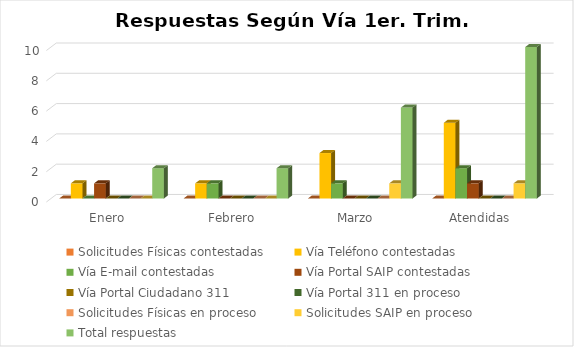
| Category | Solicitudes Físicas contestadas | Vía Teléfono contestadas | Vía E-mail contestadas | Vía Portal SAIP contestadas | Vía Portal Ciudadano 311  | Vía Portal 311 en proceso | Solicitudes Físicas en proceso | Solicitudes SAIP en proceso | Total respuestas  |
|---|---|---|---|---|---|---|---|---|---|
| Enero | 0 | 1 | 0 | 1 | 0 | 0 | 0 | 0 | 2 |
| Febrero | 0 | 1 | 1 | 0 | 0 | 0 | 0 | 0 | 2 |
| Marzo | 0 | 3 | 1 | 0 | 0 | 0 | 0 | 1 | 6 |
| Atendidas | 0 | 5 | 2 | 1 | 0 | 0 | 0 | 1 | 10 |